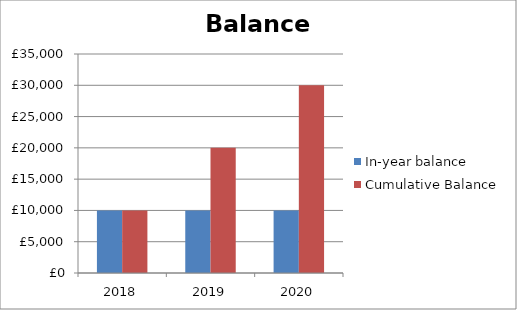
| Category | In-year balance | Cumulative Balance |
|---|---|---|
| 2018.0 | 10000 | 10000 |
| 2019.0 | 10000 | 20000 |
| 2020.0 | 10000 | 30000 |